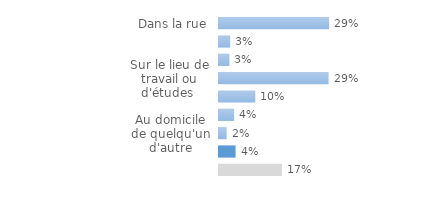
| Category | Series 0 |
|---|---|
| Dans la rue | 0.29 |
| Dans un transport en commun | 0.03 |
| Dans un établissement commercial | 0.027 |
| Sur le lieu de travail ou d'études  | 0.288 |
| Au domicile de la victime | 0.096 |
| Dans l'immeuble de la victime | 0.04 |
| Au domicile de quelqu'un d'autre | 0.02 |
| Dans un autre lieu | 0.044 |
| Sans objet ou Ne sait pas/Refus | 0.166 |